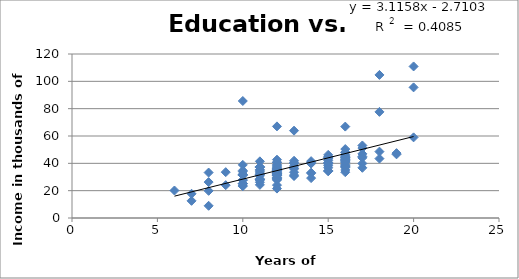
| Category | Income |
|---|---|
| 10.0 | 25.259 |
| 12.0 | 35.206 |
| 10.0 | 31.295 |
| 16.0 | 41.835 |
| 7.0 | 12.56 |
| 17.0 | 51.179 |
| 13.0 | 30.667 |
| 14.0 | 39.829 |
| 9.0 | 24.031 |
| 10.0 | 31.8 |
| 11.0 | 24.241 |
| 12.0 | 28.778 |
| 15.0 | 44.739 |
| 13.0 | 31.385 |
| 17.0 | 36.725 |
| 18.0 | 77.65 |
| 12.0 | 32.948 |
| 13.0 | 38.039 |
| 11.0 | 28.152 |
| 10.0 | 27.777 |
| 11.0 | 31.852 |
| 11.0 | 28.703 |
| 17.0 | 39.899 |
| 12.0 | 31.167 |
| 12.0 | 31.236 |
| 15.0 | 44.544 |
| 14.0 | 41.608 |
| 10.0 | 25.259 |
| 16.0 | 41.005 |
| 15.0 | 38.27 |
| 12.0 | 34.742 |
| 16.0 | 43.316 |
| 13.0 | 36.439 |
| 16.0 | 42.868 |
| 12.0 | 33.502 |
| 12.0 | 27.767 |
| 11.0 | 27.878 |
| 16.0 | 36.937 |
| 20.0 | 110.89 |
| 8.0 | 8.93 |
| 12.0 | 34.884 |
| 10.0 | 31.359 |
| 16.0 | 41.601 |
| 10.0 | 33.952 |
| 16.0 | 39.076 |
| 15.0 | 40.67 |
| 12.0 | 40.637 |
| 12.0 | 39.057 |
| 12.0 | 37.356 |
| 11.0 | 35.334 |
| 12.0 | 34.491 |
| 12.0 | 67.04 |
| 15.0 | 40.274 |
| 12.0 | 34.273 |
| 20.0 | 95.57 |
| 11.0 | 26.186 |
| 7.0 | 17.722 |
| 15.0 | 36.739 |
| 12.0 | 38.474 |
| 16.0 | 38.417 |
| 11.0 | 37.236 |
| 12.0 | 42.67 |
| 12.0 | 35.091 |
| 16.0 | 50.443 |
| 18.0 | 48.572 |
| 16.0 | 42.984 |
| 12.0 | 21.521 |
| 15.0 | 34.262 |
| 20.0 | 58.999 |
| 12.0 | 36.338 |
| 11.0 | 30.846 |
| 11.0 | 31.674 |
| 12.0 | 40.892 |
| 18.0 | 104.68 |
| 12.0 | 32.73 |
| 6.0 | 20.111 |
| 15.0 | 34.356 |
| 11.0 | 35.015 |
| 14.0 | 32.806 |
| 14.0 | 33.123 |
| 11.0 | 41.454 |
| 12.0 | 32.235 |
| 12.0 | 32.805 |
| 16.0 | 46.542 |
| 16.0 | 37.416 |
| 15.0 | 39.579 |
| 16.0 | 44.313 |
| 19.0 | 46.583 |
| 15.0 | 34.628 |
| 18.0 | 43.465 |
| 15.0 | 46.211 |
| 16.0 | 37.805 |
| 17.0 | 46.942 |
| 10.0 | 24.943 |
| 15.0 | 43.99 |
| 16.0 | 66.89 |
| 13.0 | 39.918 |
| 16.0 | 41.951 |
| 13.0 | 63.9 |
| 16.0 | 45.421 |
| 19.0 | 47.476 |
| 12.0 | 31.349 |
| 8.0 | 19.862 |
| 15.0 | 43.338 |
| 16.0 | 33.512 |
| 11.0 | 37.503 |
| 12.0 | 29.906 |
| 10.0 | 34.765 |
| 11.0 | 28.094 |
| 11.0 | 32.869 |
| 12.0 | 31.881 |
| 11.0 | 33.856 |
| 15.0 | 42.149 |
| 14.0 | 40.594 |
| 16.0 | 35.134 |
| 9.0 | 33.548 |
| 12.0 | 36.137 |
| 16.0 | 40.622 |
| 10.0 | 85.62 |
| 17.0 | 45.022 |
| 12.0 | 29.384 |
| 16.0 | 48.169 |
| 8.0 | 26.277 |
| 12.0 | 37.22 |
| 10.0 | 23.465 |
| 11.0 | 37.331 |
| 13.0 | 33.492 |
| 16.0 | 48.122 |
| 10.0 | 38.875 |
| 10.0 | 23.345 |
| 11.0 | 27.795 |
| 17.0 | 44.018 |
| 16.0 | 44.115 |
| 13.0 | 41.882 |
| 16.0 | 44.846 |
| 11.0 | 37.113 |
| 12.0 | 35.728 |
| 14.0 | 29.196 |
| 13.0 | 35.889 |
| 10.0 | 31.986 |
| 13.0 | 40.681 |
| 10.0 | 27.705 |
| 17.0 | 53.066 |
| 12.0 | 31.502 |
| 12.0 | 34.603 |
| 12.0 | 28.254 |
| 12.0 | 29.163 |
| 12.0 | 32.491 |
| 8.0 | 33.257 |
| 12.0 | 24.067 |